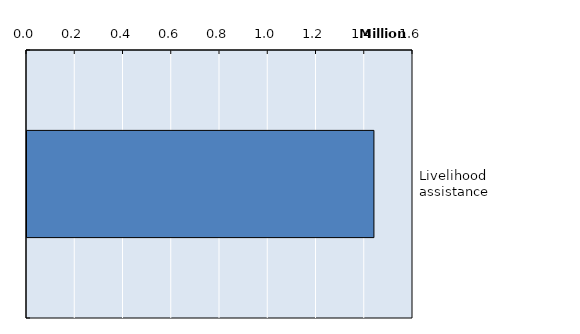
| Category | Series 0 |
|---|---|
| Livelihood assistance | 1438068 |